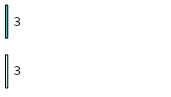
| Category | Series 0 | Series 1 |
|---|---|---|
| 0 | 3 | 3 |